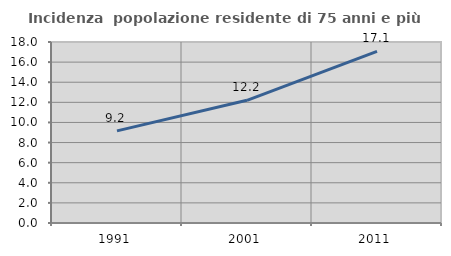
| Category | Incidenza  popolazione residente di 75 anni e più |
|---|---|
| 1991.0 | 9.16 |
| 2001.0 | 12.2 |
| 2011.0 | 17.061 |